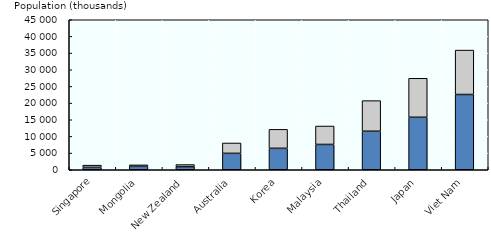
| Category | 0-14 year olds | 15-24 year olds |
|---|---|---|
| Singapore | 719.661 | 662.706 |
| Mongolia | 1019.316 | 447.101 |
| New Zealand | 936.993 | 627.721 |
| Australia | 4919.546 | 3114.474 |
| Korea | 6430.596 | 5692.721 |
| Malaysia | 7589.218 | 5532.799 |
| Thailand | 11553.638 | 9186.414 |
| Japan | 15744.494 | 11699.522 |
| Viet Nam | 22576.746 | 13321.069 |